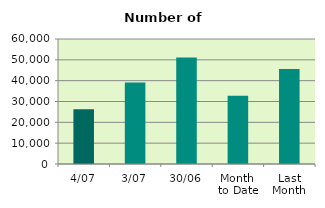
| Category | Series 0 |
|---|---|
| 4/07 | 26338 |
| 3/07 | 39146 |
| 30/06 | 51106 |
| Month 
to Date | 32742 |
| Last
Month | 45645.364 |